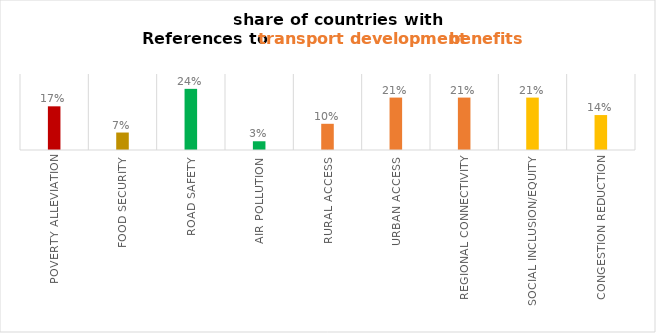
| Category | Series 0 |
|---|---|
| Poverty Alleviation | 0.172 |
| Food Security | 0.069 |
| Road Safety | 0.241 |
| Air Pollution | 0.034 |
| Rural Access | 0.103 |
| Urban Access | 0.207 |
| Regional Connectivity | 0.207 |
| Social Inclusion/Equity | 0.207 |
| Congestion Reduction | 0.138 |